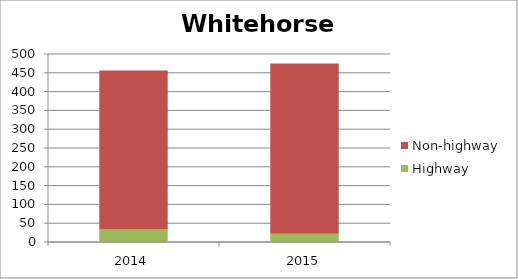
| Category | Highway | Non-highway |
|---|---|---|
| 2014.0 | 33 | 423 |
| 2015.0 | 22 | 453 |